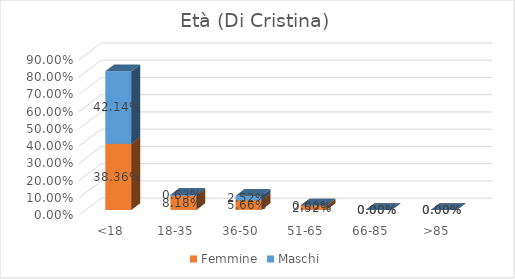
| Category | Femmine | Maschi |
|---|---|---|
| <18 | 0.384 | 0.421 |
| 18-35 | 0.082 | 0.006 |
| 36-50 | 0.057 | 0.025 |
| 51-65 | 0.025 | 0 |
| 66-85 | 0 | 0 |
| >85 | 0 | 0 |